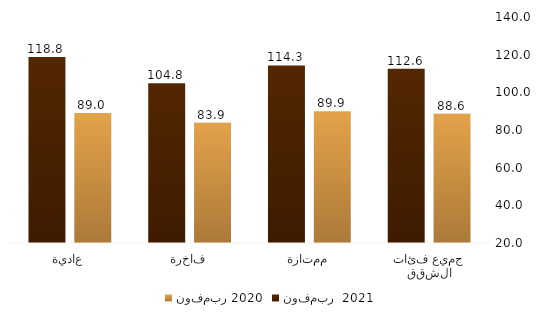
| Category | نوفمبر 2020 | نوفمبر  2021 |
|---|---|---|
| جميع فئات الشقق | 88.569 | 112.56 |
| ممتازة | 89.935 | 114.306 |
| فاخرة | 83.907 | 104.762 |
| عادية | 89.018 | 118.754 |